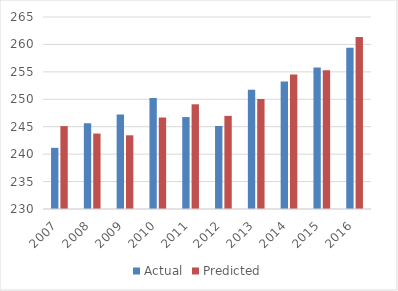
| Category | Actual | Predicted |
|---|---|---|
| 2007 | 241.155 | 245.11 |
| 2008 | 245.623 | 243.752 |
| 2009 | 247.239 | 243.433 |
| 2010 | 250.239 | 246.678 |
| 2011 | 246.758 | 249.086 |
| 2012 | 245.13 | 246.975 |
| 2013 | 251.758 | 250.055 |
| 2014 | 253.255 | 254.541 |
| 2015 | 255.775 | 255.309 |
| 2016 | 259.382 | 261.376 |